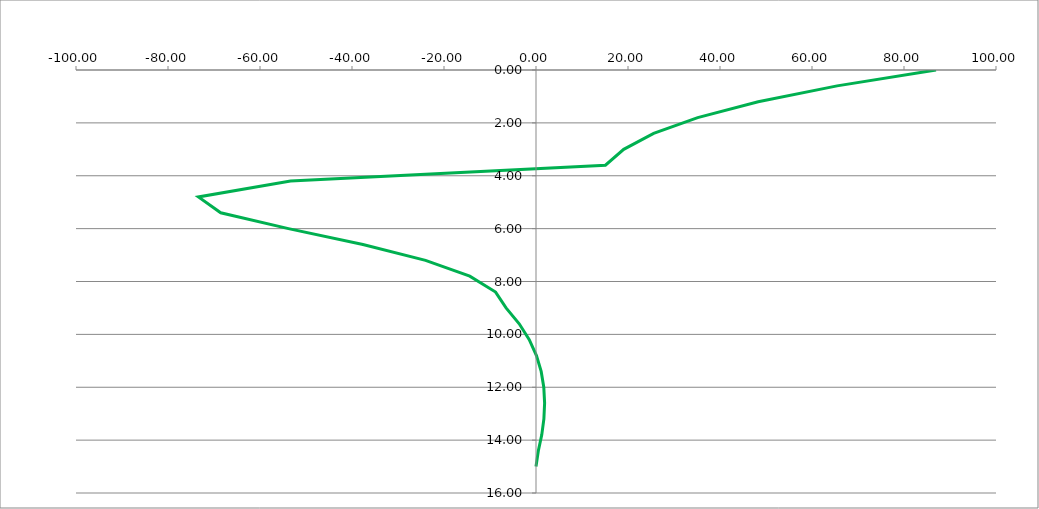
| Category | Series 0 |
|---|---|
| 86.96040644343157 | 0 |
| 65.45654874245884 | 0.6 |
| 48.302382888416105 | 1.2 |
| 35.15284823462571 | 1.8 |
| 25.574519150120977 | 2.4 |
| 19.069463422042645 | 3 |
| 15.092675894600688 | 3.6 |
| -53.355503009794575 | 4.2 |
| -73.38747410849692 | 4.8 |
| -68.54038918851097 | 5.4 |
| -53.81118264033165 | 6 |
| -37.62459986278026 | 6.6 |
| -24.015121926354766 | 7.2 |
| -14.398131852424967 | 7.8 |
| -8.783855651630745 | 8.4 |
| -6.511466017813802 | 9 |
| -3.648322968160187 | 9.6 |
| -1.466386255234056 | 10.2 |
| 0.09822777714384756 | 10.8 |
| 1.1249772444528787 | 11.4 |
| 1.6932350722833291 | 12 |
| 1.8719675954644117 | 12.6 |
| 1.7139807311757806 | 13.2 |
| 1.2540587780447652 | 13.8 |
| 0.5104748406071167 | 14.4 |
| 0.0 | 15 |